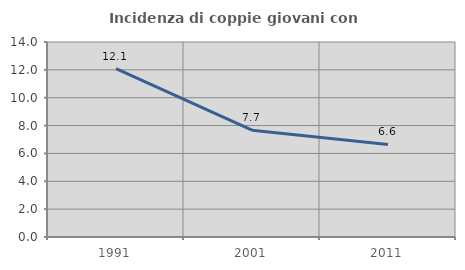
| Category | Incidenza di coppie giovani con figli |
|---|---|
| 1991.0 | 12.088 |
| 2001.0 | 7.667 |
| 2011.0 | 6.647 |